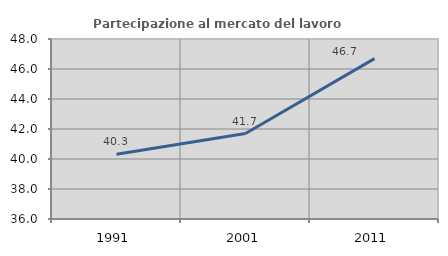
| Category | Partecipazione al mercato del lavoro  femminile |
|---|---|
| 1991.0 | 40.313 |
| 2001.0 | 41.697 |
| 2011.0 | 46.695 |